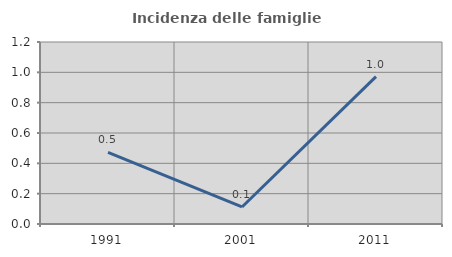
| Category | Incidenza delle famiglie numerose |
|---|---|
| 1991.0 | 0.472 |
| 2001.0 | 0.112 |
| 2011.0 | 0.972 |